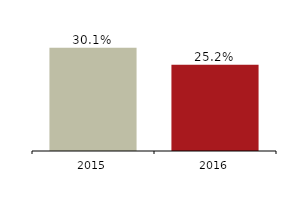
| Category | Capital adequacy ratio |
|---|---|
| 2016.0 | 0.252 |
| 2015.0 | 0.301 |